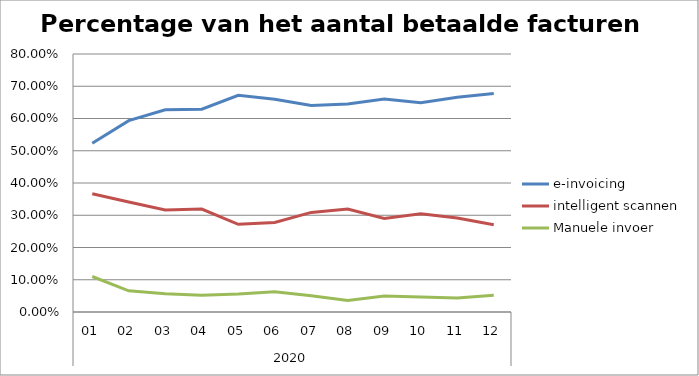
| Category | e-invoicing | intelligent scannen | Manuele invoer |
|---|---|---|---|
| 0 | 0.523 | 0.367 | 0.11 |
| 1 | 0.593 | 0.341 | 0.066 |
| 2 | 0.627 | 0.317 | 0.056 |
| 3 | 0.629 | 0.319 | 0.052 |
| 4 | 0.672 | 0.272 | 0.056 |
| 5 | 0.66 | 0.277 | 0.063 |
| 6 | 0.641 | 0.309 | 0.051 |
| 7 | 0.645 | 0.319 | 0.036 |
| 8 | 0.66 | 0.29 | 0.05 |
| 9 | 0.649 | 0.305 | 0.046 |
| 10 | 0.666 | 0.291 | 0.043 |
| 11 | 0.677 | 0.271 | 0.052 |